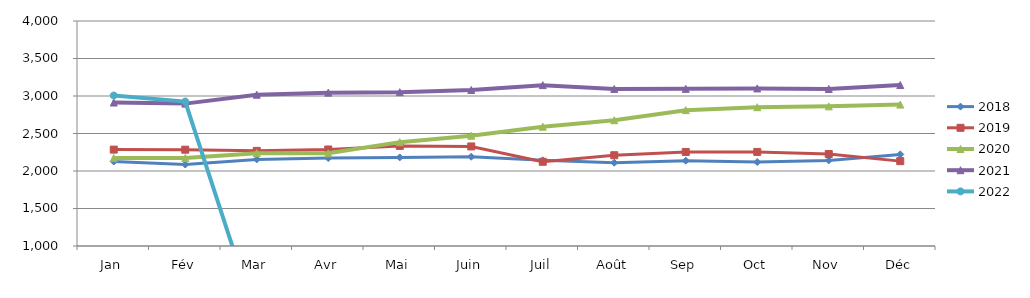
| Category | 2018 | 2019 | 2020 | 2021 | 2022 |
|---|---|---|---|---|---|
| Jan | 2126.43 | 2285.077 | 2174.068 | 2912.819 | 3006.467 |
| Fév | 2086.116 | 2284.041 | 2173.963 | 2898.489 | 2926.234 |
| Mar | 2154.19 | 2268.401 | 2238.064 | 3017.436 | 0 |
| Avr | 2172.692 | 2286.951 | 2235.688 | 3044.815 | 0 |
| Mai | 2181.426 | 2334.869 | 2384.721 | 3050.874 | 0 |
| Juin | 2190.216 | 2327.493 | 2470.094 | 3080.307 | 0 |
| Juil | 2142.84 | 2123.041 | 2589.895 | 3144.694 | 0 |
| Août | 2110.076 | 2210.394 | 2677.173 | 3094.04 | 0 |
| Sep | 2137.072 | 2253.916 | 2811.251 | 3095.309 | 0 |
| Oct | 2119.873 | 2254.192 | 2850.494 | 3100.983 | 0 |
| Nov | 2140.872 | 2226.879 | 2862.02 | 3093.674 | 0 |
| Déc | 2221.568 | 2131.58 | 2885.572 | 3146.391 | 0 |